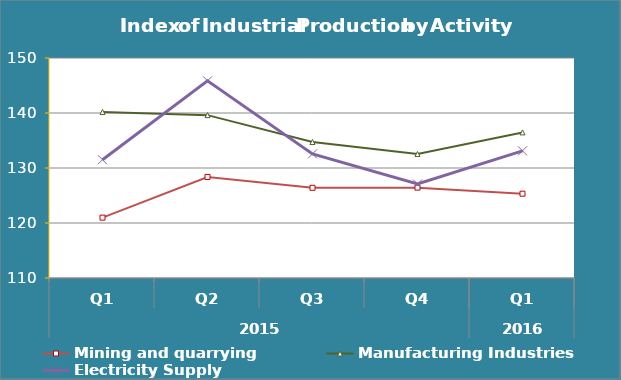
| Category | Mining and quarrying | Manufacturing Industries | Electricity Supply |
|---|---|---|---|
| 0 | 120.98 | 140.19 | 131.5 |
| 1 | 128.37 | 139.61 | 145.85 |
| 2 | 126.4 | 134.72 | 132.57 |
| 3 | 126.43 | 132.55 | 127.09 |
| 4 | 125.33 | 136.47 | 133.12 |